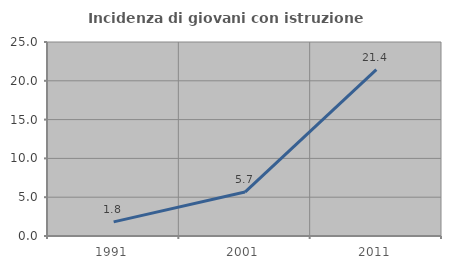
| Category | Incidenza di giovani con istruzione universitaria |
|---|---|
| 1991.0 | 1.818 |
| 2001.0 | 5.66 |
| 2011.0 | 21.429 |